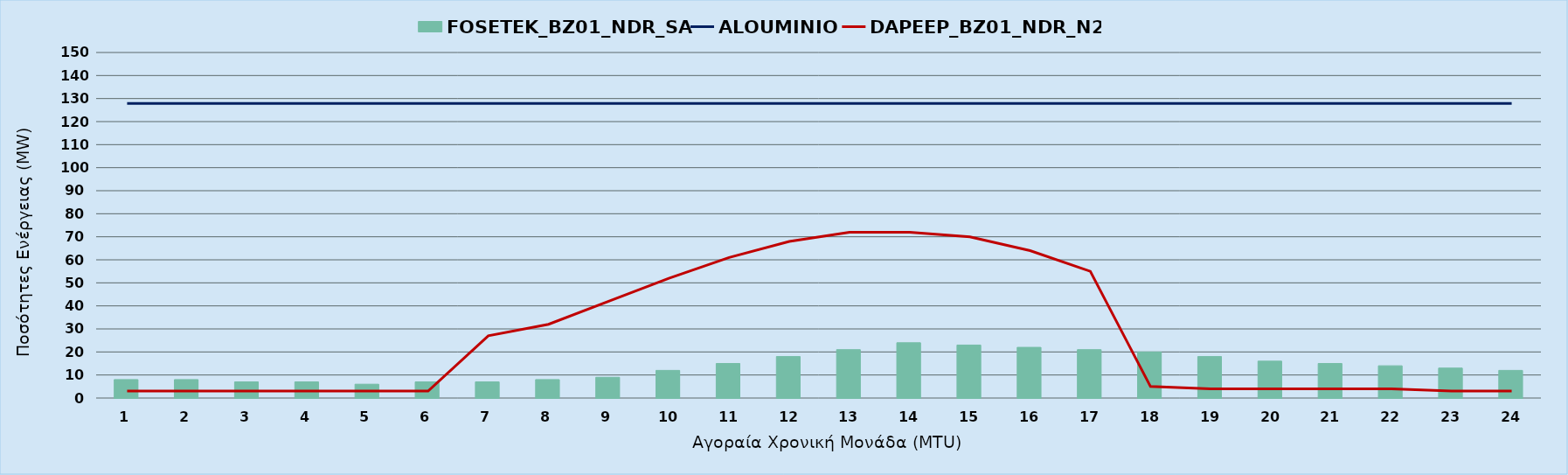
| Category | FOSETEK_BZ01_NDR_SA |
|---|---|
| 0 | 8 |
| 1 | 8 |
| 2 | 7 |
| 3 | 7 |
| 4 | 6 |
| 5 | 7 |
| 6 | 7 |
| 7 | 8 |
| 8 | 9 |
| 9 | 12 |
| 10 | 15 |
| 11 | 18 |
| 12 | 21 |
| 13 | 24 |
| 14 | 23 |
| 15 | 22 |
| 16 | 21 |
| 17 | 20 |
| 18 | 18 |
| 19 | 16 |
| 20 | 15 |
| 21 | 14 |
| 22 | 13 |
| 23 | 12 |